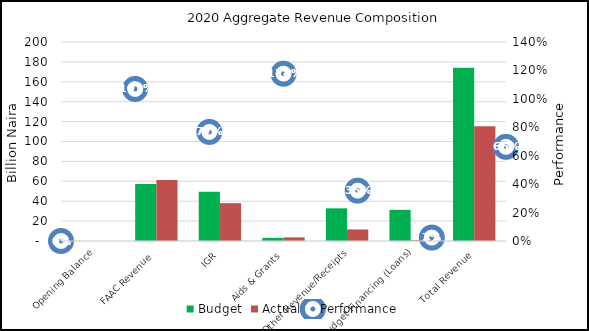
| Category | Budget | Actual |
|---|---|---|
| Opening Balance | 0 | 0 |
| FAAC Revenue  | 57271582762.46 | 61258731908.26 |
| IGR | 49578207750 | 38042733036.47 |
| Aids & Grants  | 3100000000 | 3648946285.2 |
| Other Revenue/Receipts | 32812356390 | 11626693160 |
| Budget Financing (Loans) | 31325306339 | 754749862.79 |
| Total Revenue  | 174087453241.46 | 115331854252.72 |